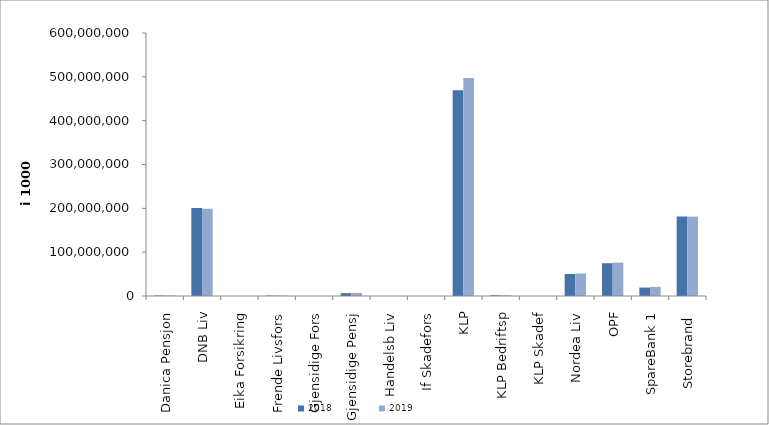
| Category | 2018 | 2019 |
|---|---|---|
| Danica Pensjon | 1087595.622 | 1147898.651 |
| DNB Liv | 201016641 | 198989780.163 |
| Eika Forsikring | 0 | 0 |
| Frende Livsfors | 833959.8 | 950096 |
| Gjensidige Fors | 0 | 0 |
| Gjensidige Pensj | 6474253 | 7082534 |
| Handelsb Liv | 22959 | 28422.661 |
| If Skadefors | 0 | 0 |
| KLP | 469261417.093 | 497212120.959 |
| KLP Bedriftsp | 1682836 | 1726673 |
| KLP Skadef | 17207.846 | 34480.175 |
| Nordea Liv | 50214570 | 51315530 |
| OPF | 74741399.904 | 76175866 |
| SpareBank 1 | 19235566.757 | 20850610.601 |
| Storebrand  | 181362430.314 | 181032450.261 |